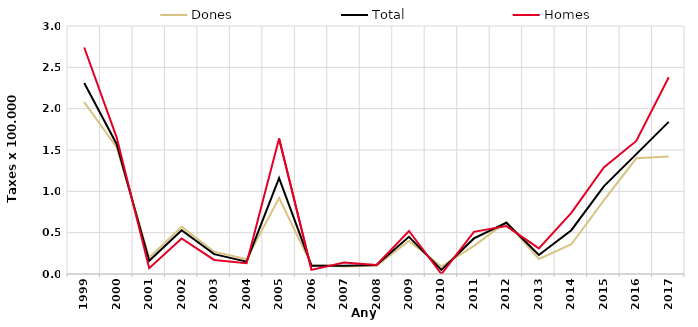
| Category | Dones | Total | Homes |
|---|---|---|---|
| 1999.0 | 2.08 | 2.31 | 2.74 |
| 2000.0 | 1.53 | 1.57 | 1.65 |
| 2001.0 | 0.2 | 0.16 | 0.07 |
| 2002.0 | 0.57 | 0.53 | 0.43 |
| 2003.0 | 0.27 | 0.24 | 0.17 |
| 2004.0 | 0.18 | 0.15 | 0.13 |
| 2005.0 | 0.92 | 1.16 | 1.64 |
| 2006.0 | 0.11 | 0.1 | 0.05 |
| 2007.0 | 0.09 | 0.1 | 0.14 |
| 2008.0 | 0.1 | 0.11 | 0.11 |
| 2009.0 | 0.4 | 0.45 | 0.52 |
| 2010.0 | 0.09 | 0.05 | 0 |
| 2011.0 | 0.34 | 0.43 | 0.51 |
| 2012.0 | 0.63 | 0.62 | 0.58 |
| 2013.0 | 0.18 | 0.23 | 0.31 |
| 2014.0 | 0.36 | 0.53 | 0.74 |
| 2015.0 | 0.89 | 1.06 | 1.29 |
| 2016.0 | 1.4 | 1.45 | 1.61 |
| 2017.0 | 1.42 | 1.84 | 2.38 |